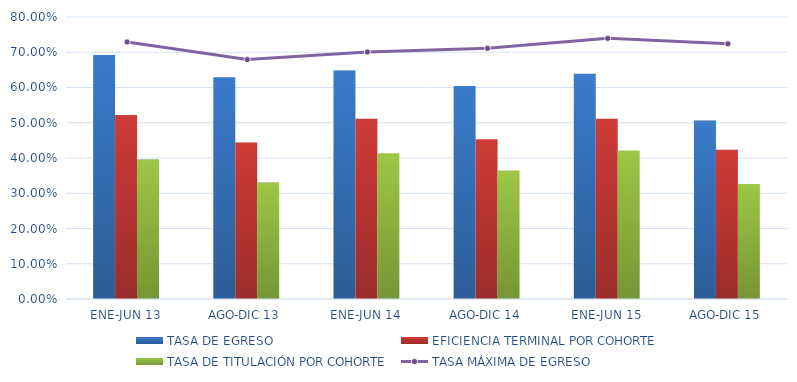
| Category | TASA DE EGRESO | EFICIENCIA TERMINAL POR COHORTE | TASA DE TITULACIÓN POR COHORTE |
|---|---|---|---|
| ENE-JUN 13 | 0.693 | 0.522 | 0.396 |
| AGO-DIC 13 | 0.629 | 0.444 | 0.33 |
| ENE-JUN 14 | 0.648 | 0.512 | 0.413 |
| AGO-DIC 14 | 0.604 | 0.453 | 0.365 |
| ENE-JUN 15 | 0.639 | 0.511 | 0.421 |
| AGO-DIC 15 | 0.506 | 0.424 | 0.326 |